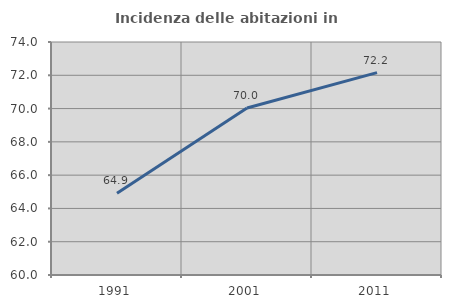
| Category | Incidenza delle abitazioni in proprietà  |
|---|---|
| 1991.0 | 64.915 |
| 2001.0 | 70.037 |
| 2011.0 | 72.163 |